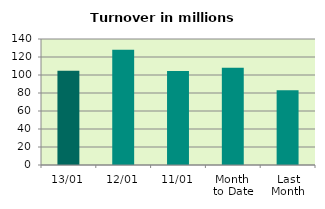
| Category | Series 0 |
|---|---|
| 13/01 | 104.747 |
| 12/01 | 128.002 |
| 11/01 | 104.405 |
| Month 
to Date | 108.123 |
| Last
Month | 83.19 |